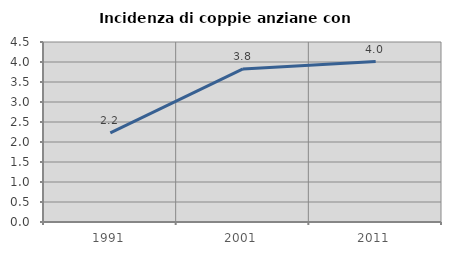
| Category | Incidenza di coppie anziane con figli |
|---|---|
| 1991.0 | 2.23 |
| 2001.0 | 3.826 |
| 2011.0 | 4.012 |